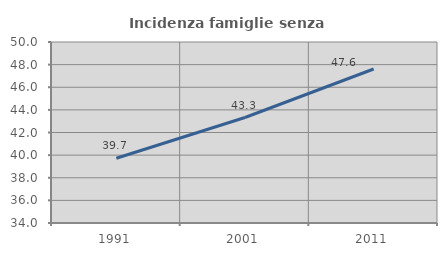
| Category | Incidenza famiglie senza nuclei |
|---|---|
| 1991.0 | 39.72 |
| 2001.0 | 43.326 |
| 2011.0 | 47.611 |